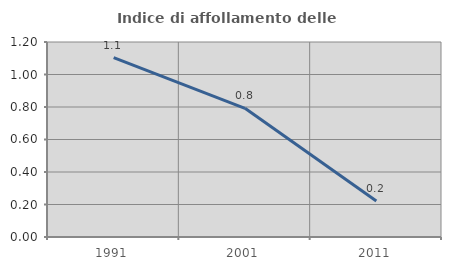
| Category | Indice di affollamento delle abitazioni  |
|---|---|
| 1991.0 | 1.103 |
| 2001.0 | 0.792 |
| 2011.0 | 0.221 |